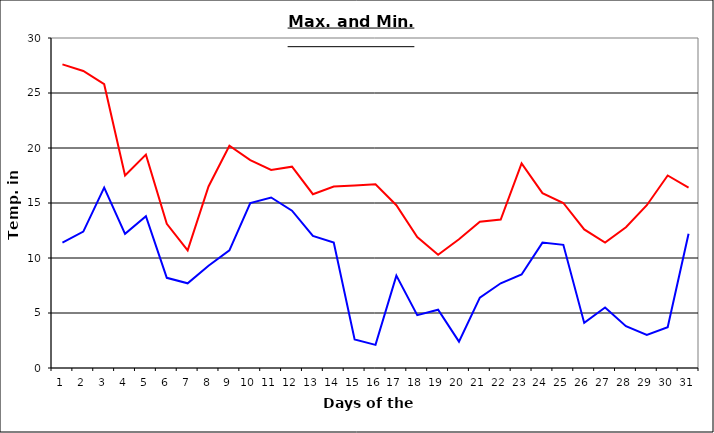
| Category | Series 0 | Series 1 |
|---|---|---|
| 0 | 27.6 | 11.4 |
| 1 | 27 | 12.4 |
| 2 | 25.8 | 16.4 |
| 3 | 17.5 | 12.2 |
| 4 | 19.4 | 13.8 |
| 5 | 13.1 | 8.2 |
| 6 | 10.7 | 7.7 |
| 7 | 16.5 | 9.3 |
| 8 | 20.2 | 10.7 |
| 9 | 18.9 | 15 |
| 10 | 18 | 15.5 |
| 11 | 18.3 | 14.3 |
| 12 | 15.8 | 12 |
| 13 | 16.5 | 11.4 |
| 14 | 16.6 | 2.6 |
| 15 | 16.7 | 2.1 |
| 16 | 14.8 | 8.4 |
| 17 | 11.9 | 4.8 |
| 18 | 10.3 | 5.3 |
| 19 | 11.7 | 2.4 |
| 20 | 13.3 | 6.4 |
| 21 | 13.5 | 7.7 |
| 22 | 18.6 | 8.5 |
| 23 | 15.9 | 11.4 |
| 24 | 15 | 11.2 |
| 25 | 12.6 | 4.1 |
| 26 | 11.4 | 5.5 |
| 27 | 12.8 | 3.8 |
| 28 | 14.8 | 3 |
| 29 | 17.5 | 3.7 |
| 30 | 16.4 | 12.2 |